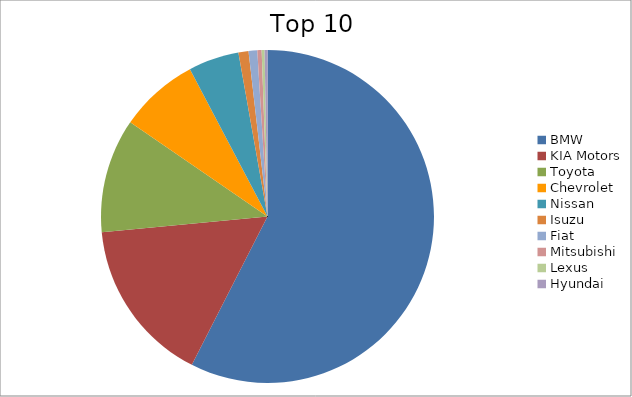
| Category | Series 0 |
|---|---|
| BMW | 57.5 |
| KIA Motors | 15.99 |
| Toyota | 11.08 |
| Chevrolet | 7.71 |
| Nissan | 4.91 |
| Isuzu | 0.98 |
| Fiat | 0.84 |
| Mitsubishi | 0.42 |
| Lexus | 0.28 |
| Hyundai | 0.28 |